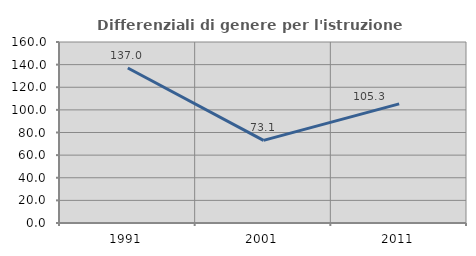
| Category | Differenziali di genere per l'istruzione superiore |
|---|---|
| 1991.0 | 137.002 |
| 2001.0 | 73.068 |
| 2011.0 | 105.291 |